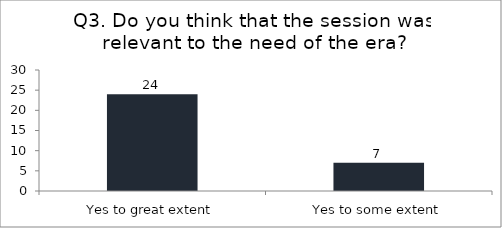
| Category | Q3. Do you think that the session was relevant to the need of the era? |
|---|---|
| Yes to great extent | 24 |
| Yes to some extent | 7 |